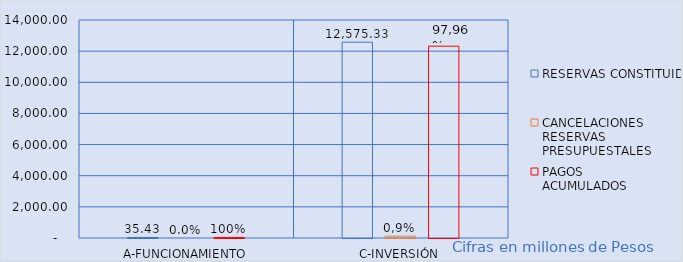
| Category | RESERVAS CONSTITUIDAS
 | CANCELACIONES RESERVAS PRESUPUESTALES
  | PAGOS
ACUMULADOS
 |
|---|---|---|---|
| A-FUNCIONAMIENTO | 35.432 | 0 | 35.432 |
| C-INVERSIÓN | 12575.331 | 112.613 | 12318.718 |